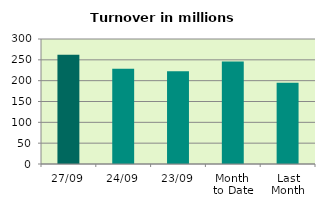
| Category | Series 0 |
|---|---|
| 27/09 | 262.382 |
| 24/09 | 228.384 |
| 23/09 | 222.853 |
| Month 
to Date | 245.861 |
| Last
Month | 194.848 |